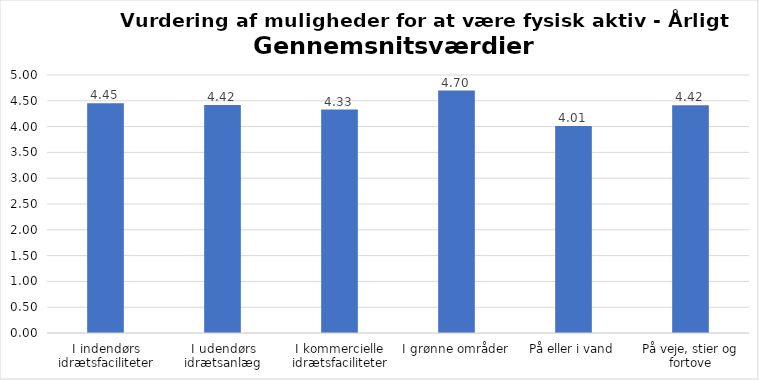
| Category | Gennemsnit |
|---|---|
| I indendørs idrætsfaciliteter | 4.452 |
| I udendørs idrætsanlæg | 4.416 |
| I kommercielle idrætsfaciliteter | 4.33 |
| I grønne områder | 4.699 |
| På eller i vand | 4.014 |
| På veje, stier og fortove | 4.415 |